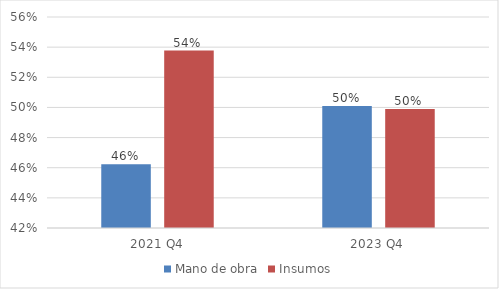
| Category | Mano de obra | Insumos |
|---|---|---|
| 2021 Q4 | 0.462 | 0.538 |
| 2023 Q4 | 0.501 | 0.499 |